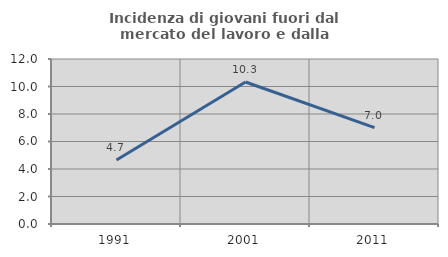
| Category | Incidenza di giovani fuori dal mercato del lavoro e dalla formazione  |
|---|---|
| 1991.0 | 4.659 |
| 2001.0 | 10.329 |
| 2011.0 | 7.006 |